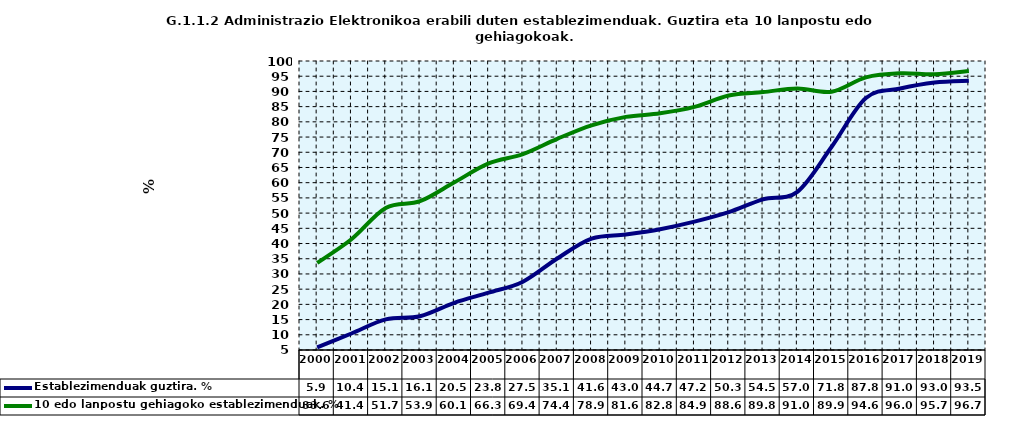
| Category | Establezimenduak guztira. % | 10 edo lanpostu gehiagoko establezimenduak. % |
|---|---|---|
| 2000.0 | 5.883 | 33.627 |
| 2001.0 | 10.421 | 41.411 |
| 2002.0 | 15.068 | 51.694 |
| 2003.0 | 16.098 | 53.904 |
| 2004.0 | 20.515 | 60.107 |
| 2005.0 | 23.837 | 66.349 |
| 2006.0 | 27.46 | 69.402 |
| 2007.0 | 35.078 | 74.42 |
| 2008.0 | 41.612 | 78.862 |
| 2009.0 | 42.972 | 81.627 |
| 2010.0 | 44.715 | 82.794 |
| 2011.0 | 47.2 | 84.9 |
| 2012.0 | 50.321 | 88.639 |
| 2013.0 | 54.524 | 89.774 |
| 2014.0 | 56.986 | 90.972 |
| 2015.0 | 71.8 | 89.9 |
| 2016.0 | 87.813 | 94.63 |
| 2017.0 | 90.959 | 95.964 |
| 2018.0 | 92.961 | 95.655 |
| 2019.0 | 93.517 | 96.71 |